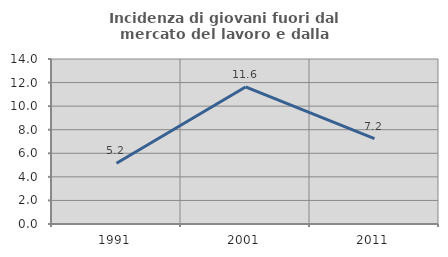
| Category | Incidenza di giovani fuori dal mercato del lavoro e dalla formazione  |
|---|---|
| 1991.0 | 5.15 |
| 2001.0 | 11.628 |
| 2011.0 | 7.246 |